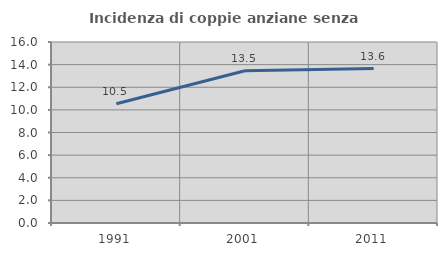
| Category | Incidenza di coppie anziane senza figli  |
|---|---|
| 1991.0 | 10.539 |
| 2001.0 | 13.452 |
| 2011.0 | 13.647 |